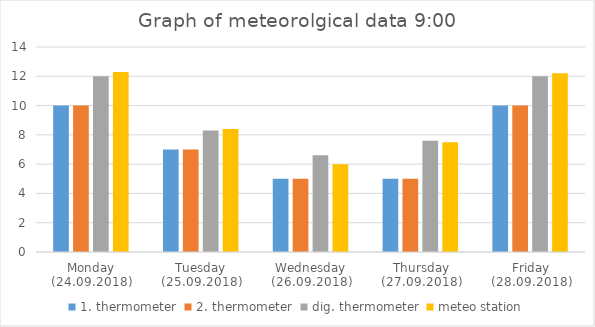
| Category | 1. thermometer | 2. thermometer | dig. thermometer | meteo station |
|---|---|---|---|---|
| Monday (24.09.2018) | 10 | 10 | 12 | 12.3 |
| Tuesday (25.09.2018) | 7 | 7 | 8.3 | 8.4 |
| Wednesday (26.09.2018) | 5 | 5 | 6.6 | 6 |
| Thursday (27.09.2018) | 5 | 5 | 7.6 | 7.5 |
| Friday (28.09.2018) | 10 | 10 | 12 | 12.2 |